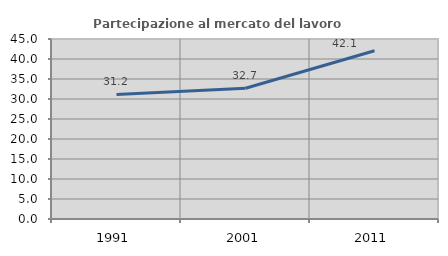
| Category | Partecipazione al mercato del lavoro  femminile |
|---|---|
| 1991.0 | 31.156 |
| 2001.0 | 32.673 |
| 2011.0 | 42.051 |